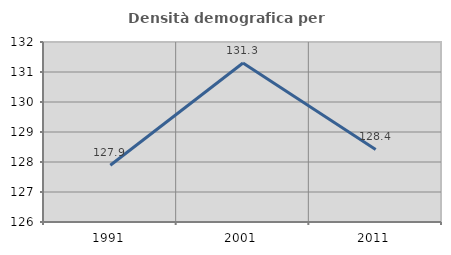
| Category | Densità demografica |
|---|---|
| 1991.0 | 127.891 |
| 2001.0 | 131.298 |
| 2011.0 | 128.42 |